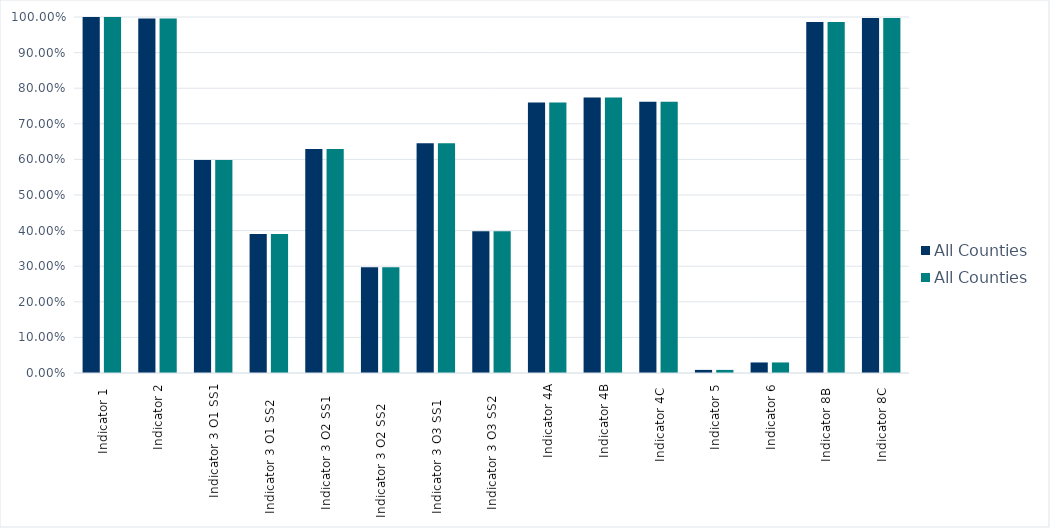
| Category | All Counties |
|---|---|
| Indicator 1  | 1 |
| Indicator 2 | 0.996 |
| Indicator 3 O1 SS1 | 0.598 |
| Indicator 3 O1 SS2     | 0.391 |
| Indicator 3 O2 SS1    | 0.63 |
| Indicator 3 O2 SS2      | 0.297 |
| Indicator 3 O3 SS1     | 0.645 |
| Indicator 3 O3 SS2    | 0.398 |
| Indicator 4A | 0.76 |
| Indicator 4B | 0.774 |
| Indicator 4C  | 0.762 |
| Indicator 5 | 0.009 |
| Indicator 6 | 0.03 |
| Indicator 8B  | 0.986 |
| Indicator 8C  | 0.997 |